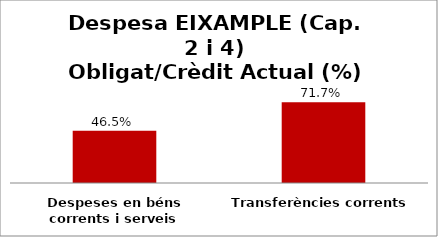
| Category | Series 0 |
|---|---|
| Despeses en béns corrents i serveis | 0.465 |
| Transferències corrents | 0.717 |